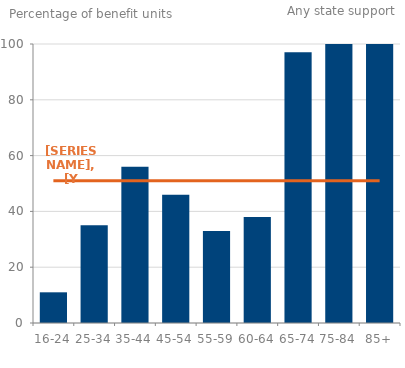
| Category | Series 0 |
|---|---|
| 0 | 11 |
| 1 | 35 |
| 2 | 56 |
| 3 | 46 |
| 4 | 33 |
| 5 | 38 |
| 6 | 97 |
| 7 | 100 |
| 8 | 100 |